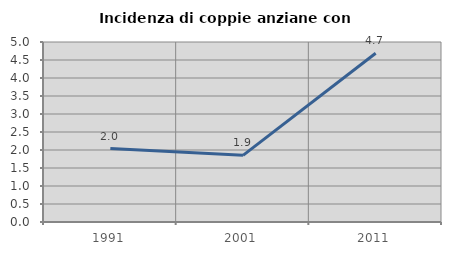
| Category | Incidenza di coppie anziane con figli |
|---|---|
| 1991.0 | 2.041 |
| 2001.0 | 1.852 |
| 2011.0 | 4.688 |